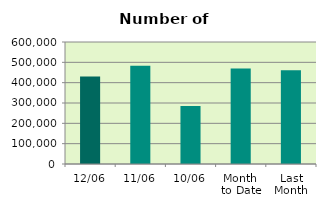
| Category | Series 0 |
|---|---|
| 12/06 | 430386 |
| 11/06 | 483180 |
| 10/06 | 285438 |
| Month 
to Date | 469581.75 |
| Last
Month | 461152.818 |